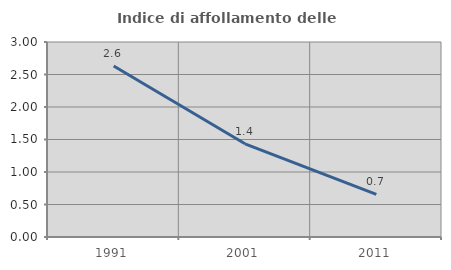
| Category | Indice di affollamento delle abitazioni  |
|---|---|
| 1991.0 | 2.632 |
| 2001.0 | 1.434 |
| 2011.0 | 0.657 |